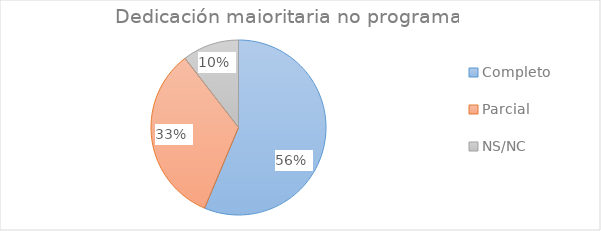
| Category | Series 0 |
|---|---|
| Completo | 0.563 |
| Parcial | 0.332 |
| NS/NC | 0.105 |